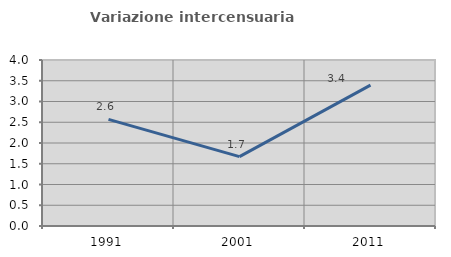
| Category | Variazione intercensuaria annua |
|---|---|
| 1991.0 | 2.57 |
| 2001.0 | 1.672 |
| 2011.0 | 3.393 |